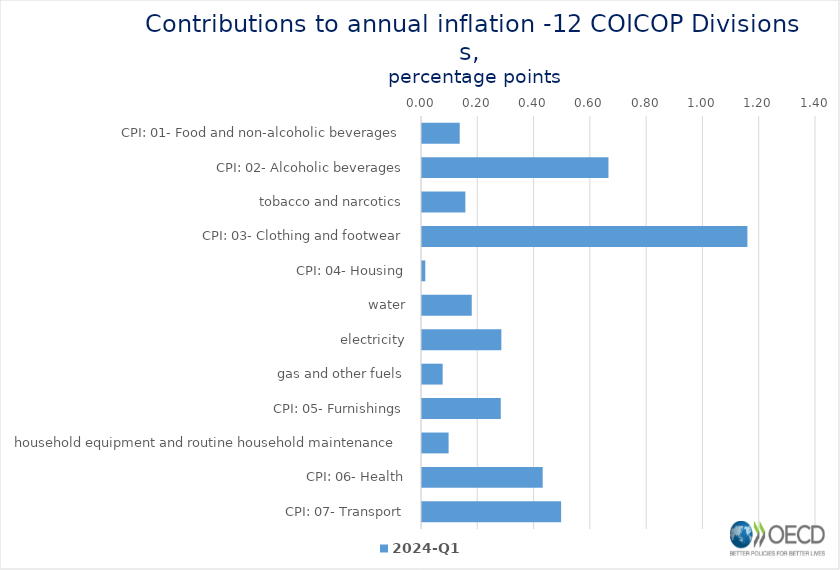
| Category | 2024-Q1 |
|---|---|
| CPI: 01- Food and non-alcoholic beverages | 0.134 |
| CPI: 02- Alcoholic beverages, tobacco and narcotics | 0.663 |
| CPI: 03- Clothing and footwear | 0.154 |
| CPI: 04- Housing, water, electricity, gas and other fuels | 1.156 |
| CPI: 05- Furnishings, household equipment and routine household maintenance | 0.012 |
| CPI: 06- Health | 0.177 |
| CPI: 07- Transport | 0.282 |
| CPI: 08- Communication | 0.073 |
| CPI: 09- Recreation and culture | 0.28 |
| CPI: 10- Education | 0.095 |
| CPI: 11- Restaurants and hotels | 0.429 |
| CPI: 12- Miscellaneous goods and services | 0.494 |